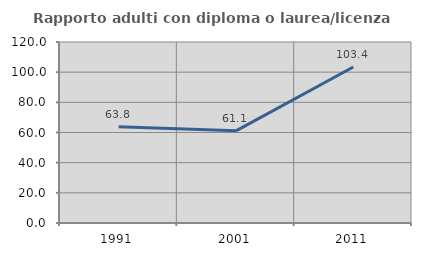
| Category | Rapporto adulti con diploma o laurea/licenza media  |
|---|---|
| 1991.0 | 63.816 |
| 2001.0 | 61.089 |
| 2011.0 | 103.448 |